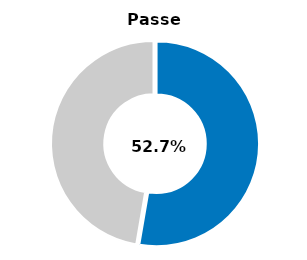
| Category | Series 0 |
|---|---|
| Passed | 0.527 |
| Other | 0.473 |